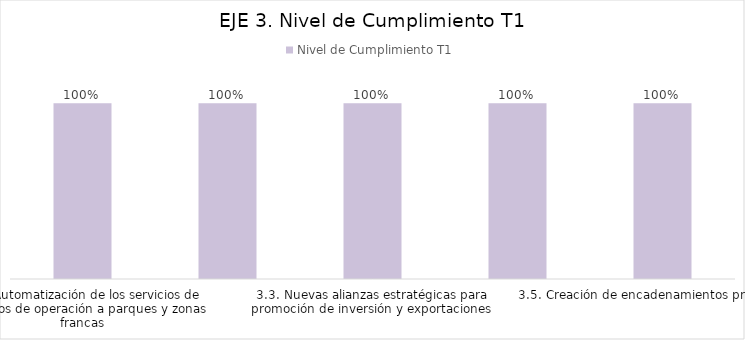
| Category | Nivel de Cumplimiento T1 |
|---|---|
| 3.1. Automatización de los servicios de permisos de operación a parques y zonas francas | 1 |
| 3.2.Nuevas instalaciones de zonas francas | 1 |
| 3.3. Nuevas alianzas estratégicas para promoción de inversión y exportaciones | 1 |
| 3.4. Autorización de ampliación en parques de zonas francas | 1 |
| 3.5. Creación de encadenamientos productivos | 1 |